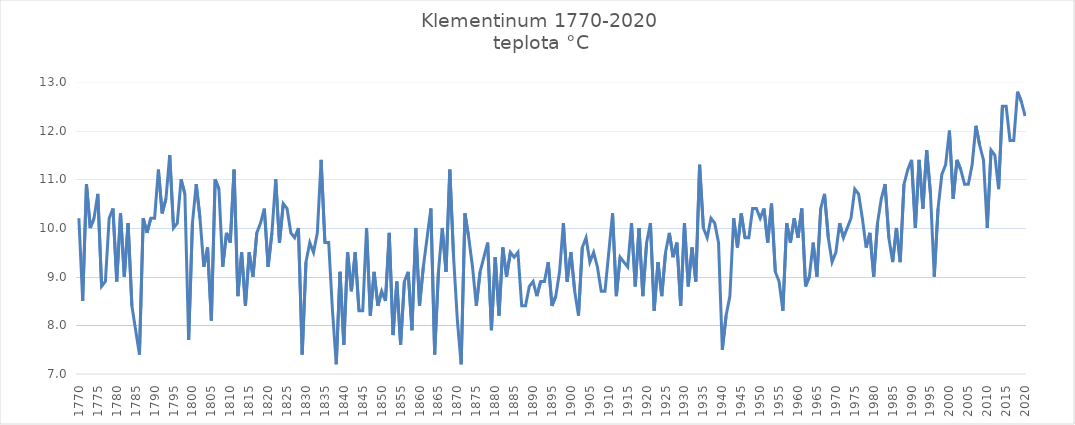
| Category | teplota °C |
|---|---|
| 1770 | 10.2 |
| 1771 | 8.5 |
| 1772 | 10.9 |
| 1773 | 10 |
| 1774 | 10.2 |
| 1775 | 10.7 |
| 1776 | 8.8 |
| 1777 | 8.9 |
| 1778 | 10.2 |
| 1779 | 10.4 |
| 1780 | 8.9 |
| 1781 | 10.3 |
| 1782 | 9 |
| 1783 | 10.1 |
| 1784 | 8.4 |
| 1785 | 7.9 |
| 1786 | 7.4 |
| 1787 | 10.2 |
| 1788 | 9.9 |
| 1789 | 10.2 |
| 1790 | 10.2 |
| 1791 | 11.2 |
| 1792 | 10.3 |
| 1793 | 10.6 |
| 1794 | 11.5 |
| 1795 | 10 |
| 1796 | 10.1 |
| 1797 | 11 |
| 1798 | 10.7 |
| 1799 | 7.7 |
| 1800 | 10.1 |
| 1801 | 10.9 |
| 1802 | 10.2 |
| 1803 | 9.2 |
| 1804 | 9.6 |
| 1805 | 8.1 |
| 1806 | 11 |
| 1807 | 10.8 |
| 1808 | 9.2 |
| 1809 | 9.9 |
| 1810 | 9.7 |
| 1811 | 11.2 |
| 1812 | 8.6 |
| 1813 | 9.5 |
| 1814 | 8.4 |
| 1815 | 9.5 |
| 1816 | 9 |
| 1817 | 9.9 |
| 1818 | 10.1 |
| 1819 | 10.4 |
| 1820 | 9.2 |
| 1821 | 9.9 |
| 1822 | 11 |
| 1823 | 9.7 |
| 1824 | 10.5 |
| 1825 | 10.4 |
| 1826 | 9.9 |
| 1827 | 9.8 |
| 1828 | 10 |
| 1829 | 7.4 |
| 1830 | 9.3 |
| 1831 | 9.7 |
| 1832 | 9.5 |
| 1833 | 9.9 |
| 1834 | 11.4 |
| 1835 | 9.7 |
| 1836 | 9.7 |
| 1837 | 8.3 |
| 1838 | 7.2 |
| 1839 | 9.1 |
| 1840 | 7.6 |
| 1841 | 9.5 |
| 1842 | 8.7 |
| 1843 | 9.5 |
| 1844 | 8.3 |
| 1845 | 8.3 |
| 1846 | 10 |
| 1847 | 8.2 |
| 1848 | 9.1 |
| 1849 | 8.4 |
| 1850 | 8.7 |
| 1851 | 8.5 |
| 1852 | 9.9 |
| 1853 | 7.8 |
| 1854 | 8.9 |
| 1855 | 7.6 |
| 1856 | 8.9 |
| 1857 | 9.1 |
| 1858 | 7.9 |
| 1859 | 10 |
| 1860 | 8.4 |
| 1861 | 9.2 |
| 1862 | 9.8 |
| 1863 | 10.4 |
| 1864 | 7.4 |
| 1865 | 9.1 |
| 1866 | 10 |
| 1867 | 9.1 |
| 1868 | 11.2 |
| 1869 | 9.4 |
| 1870 | 8.1 |
| 1871 | 7.2 |
| 1872 | 10.3 |
| 1873 | 9.8 |
| 1874 | 9.2 |
| 1875 | 8.4 |
| 1876 | 9.1 |
| 1877 | 9.4 |
| 1878 | 9.7 |
| 1879 | 7.9 |
| 1880 | 9.4 |
| 1881 | 8.2 |
| 1882 | 9.6 |
| 1883 | 9 |
| 1884 | 9.5 |
| 1885 | 9.4 |
| 1886 | 9.5 |
| 1887 | 8.4 |
| 1888 | 8.4 |
| 1889 | 8.8 |
| 1890 | 8.9 |
| 1891 | 8.6 |
| 1892 | 8.9 |
| 1893 | 8.9 |
| 1894 | 9.3 |
| 1895 | 8.4 |
| 1896 | 8.6 |
| 1897 | 9.1 |
| 1898 | 10.1 |
| 1899 | 8.9 |
| 1900 | 9.5 |
| 1901 | 8.7 |
| 1902 | 8.2 |
| 1903 | 9.6 |
| 1904 | 9.8 |
| 1905 | 9.3 |
| 1906 | 9.5 |
| 1907 | 9.2 |
| 1908 | 8.7 |
| 1909 | 8.7 |
| 1910 | 9.5 |
| 1911 | 10.3 |
| 1912 | 8.6 |
| 1913 | 9.4 |
| 1914 | 9.3 |
| 1915 | 9.2 |
| 1916 | 10.1 |
| 1917 | 8.8 |
| 1918 | 10 |
| 1919 | 8.6 |
| 1920 | 9.7 |
| 1921 | 10.1 |
| 1922 | 8.3 |
| 1923 | 9.3 |
| 1924 | 8.6 |
| 1925 | 9.5 |
| 1926 | 9.9 |
| 1927 | 9.4 |
| 1928 | 9.7 |
| 1929 | 8.4 |
| 1930 | 10.1 |
| 1931 | 8.8 |
| 1932 | 9.6 |
| 1933 | 8.9 |
| 1934 | 11.3 |
| 1935 | 10 |
| 1936 | 9.8 |
| 1937 | 10.2 |
| 1938 | 10.1 |
| 1939 | 9.7 |
| 1940 | 7.5 |
| 1941 | 8.2 |
| 1942 | 8.6 |
| 1943 | 10.2 |
| 1944 | 9.6 |
| 1945 | 10.3 |
| 1946 | 9.8 |
| 1947 | 9.8 |
| 1948 | 10.4 |
| 1949 | 10.4 |
| 1950 | 10.2 |
| 1951 | 10.4 |
| 1952 | 9.7 |
| 1953 | 10.5 |
| 1954 | 9.1 |
| 1955 | 8.9 |
| 1956 | 8.3 |
| 1957 | 10.1 |
| 1958 | 9.7 |
| 1959 | 10.2 |
| 1960 | 9.8 |
| 1961 | 10.4 |
| 1962 | 8.8 |
| 1963 | 9 |
| 1964 | 9.7 |
| 1965 | 9 |
| 1966 | 10.4 |
| 1967 | 10.7 |
| 1968 | 9.8 |
| 1969 | 9.3 |
| 1970 | 9.5 |
| 1971 | 10.1 |
| 1972 | 9.8 |
| 1973 | 10 |
| 1974 | 10.2 |
| 1975 | 10.8 |
| 1976 | 10.7 |
| 1977 | 10.2 |
| 1978 | 9.6 |
| 1979 | 9.9 |
| 1980 | 9 |
| 1981 | 10.1 |
| 1982 | 10.6 |
| 1983 | 10.9 |
| 1984 | 9.8 |
| 1985 | 9.3 |
| 1986 | 10 |
| 1987 | 9.3 |
| 1988 | 10.9 |
| 1989 | 11.2 |
| 1990 | 11.4 |
| 1991 | 10 |
| 1992 | 11.4 |
| 1993 | 10.4 |
| 1994 | 11.6 |
| 1995 | 10.7 |
| 1996 | 9 |
| 1997 | 10.4 |
| 1998 | 11.1 |
| 1999 | 11.3 |
| 2000 | 12 |
| 2001 | 10.6 |
| 2002 | 11.4 |
| 2003 | 11.2 |
| 2004 | 10.9 |
| 2005 | 10.9 |
| 2006 | 11.3 |
| 2007 | 12.1 |
| 2008 | 11.7 |
| 2009 | 11.4 |
| 2010 | 10 |
| 2011 | 11.6 |
| 2012 | 11.5 |
| 2013 | 10.8 |
| 2014 | 12.5 |
| 2015 | 12.5 |
| 2016 | 11.8 |
| 2017 | 11.8 |
| 2018 | 12.8 |
| 2019 | 12.6 |
| 2020 | 12.3 |